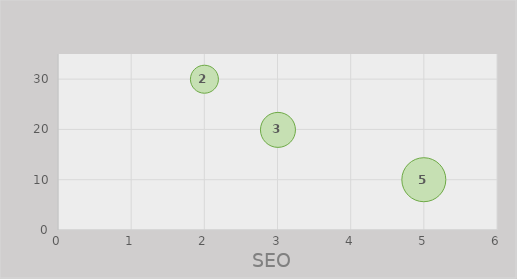
| Category | SEO |
|---|---|
| 5.0 | 10 |
| 3.0 | 20 |
| 2.0 | 30 |